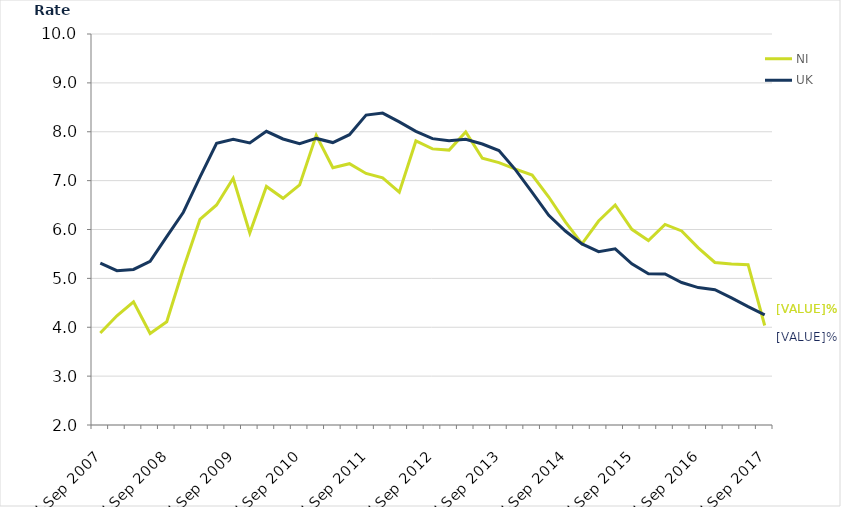
| Category | NI | UK |
|---|---|---|
| Jul-Sep 2007 | 3.881 | 5.31 |
| Oct-Dec 2007 | 4.234 | 5.157 |
| Jan-Mar 2008 | 4.52 | 5.183 |
| Apr-Jun 2008 | 3.873 | 5.35 |
| Jul-Sep 2008 | 4.111 | 5.855 |
| Oct-Dec 2008 | 5.202 | 6.353 |
| Jan-Mar 2009 | 6.205 | 7.072 |
| Apr-Jun 2009 | 6.503 | 7.764 |
| Jul-Sep 2009 | 7.048 | 7.847 |
| Oct-Dec 2009 | 5.928 | 7.773 |
| Jan-Mar 2010 | 6.881 | 8.01 |
| Apr-Jun 2010 | 6.638 | 7.852 |
| Jul-Sep 2010 | 6.912 | 7.755 |
| Oct-Dec 2010 | 7.928 | 7.863 |
| Jan-Mar 2011 | 7.263 | 7.778 |
| Apr-Jun 2011 | 7.346 | 7.94 |
| Jul-Sep 2011 | 7.146 | 8.341 |
| Oct-Dec 2011 | 7.058 | 8.382 |
| Jan-Mar 2012 | 6.765 | 8.203 |
| Apr-Jun 2012 | 7.812 | 8.008 |
| Jul-Sep 2012 | 7.649 | 7.859 |
| Oct-Dec 2012 | 7.625 | 7.815 |
| Jan-Mar 2013 | 7.996 | 7.847 |
| Apr-Jun 2013 | 7.458 | 7.749 |
| Jul-Sep 2013 | 7.369 | 7.614 |
| Oct-Dec 2013 | 7.236 | 7.221 |
| Jan-Mar 2014 | 7.115 | 6.758 |
| Apr-Jun 2014 | 6.664 | 6.289 |
| Jul-Sep 2014 | 6.157 | 5.968 |
| Oct-Dec 2014 | 5.707 | 5.706 |
| Jan-Mar 2015 | 6.174 | 5.547 |
| Apr-Jun 2015 | 6.502 | 5.605 |
| Jul-Sep 2015 | 6.004 | 5.298 |
| Oct-Dec 2015 | 5.774 | 5.093 |
| Jan-Mar 2016 | 6.103 | 5.09 |
| Apr-Jun 2016 | 5.97 | 4.915 |
| Jul-Sep 2016 | 5.625 | 4.812 |
| Oct-Dec 2016 | 5.325 | 4.769 |
| Jan-Mar 2017 | 5.295 | 4.6 |
| Apr-Jun 2017 | 5.281 | 4.422 |
| Jul-Sep 2017 | 4.036 | 4.254 |